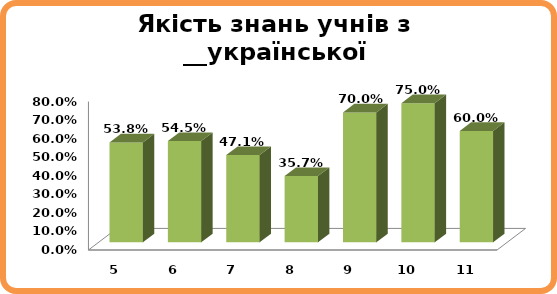
| Category | Series 0 |
|---|---|
| 5.0 | 0.538 |
| 6.0 | 0.545 |
| 7.0 | 0.471 |
| 8.0 | 0.357 |
| 9.0 | 0.7 |
| 10.0 | 0.75 |
| 11.0 | 0.6 |